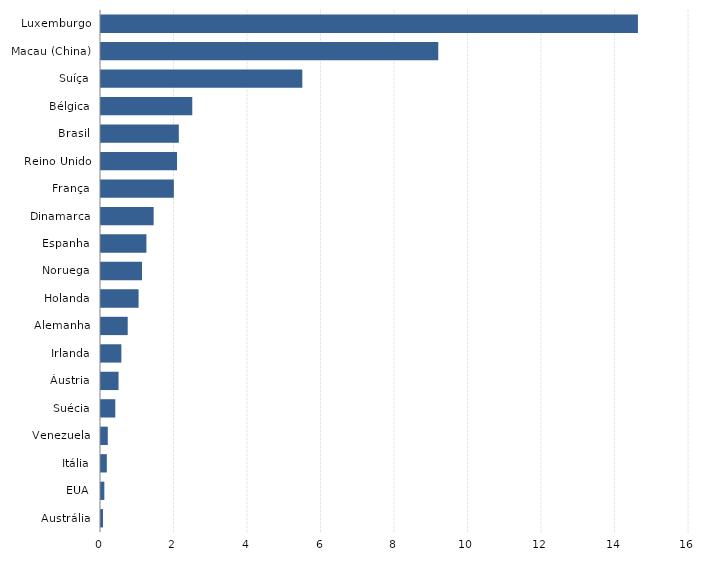
| Category | Series 0 |
|---|---|
| Austrália | 0.054 |
| EUA | 0.091 |
| Itália | 0.159 |
| Venezuela | 0.185 |
| Suécia | 0.389 |
| Áustria | 0.477 |
| Irlanda | 0.554 |
| Alemanha | 0.727 |
| Holanda | 1.023 |
| Noruega | 1.116 |
| Espanha | 1.236 |
| Dinamarca | 1.433 |
| França | 1.982 |
| Reino Unido | 2.068 |
| Brasil | 2.118 |
| Bélgica | 2.484 |
| Suíça | 5.478 |
| Macau (China) | 9.178 |
| Luxemburgo | 14.611 |